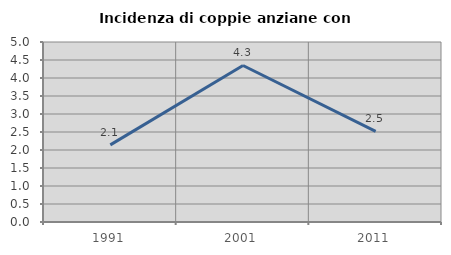
| Category | Incidenza di coppie anziane con figli |
|---|---|
| 1991.0 | 2.143 |
| 2001.0 | 4.348 |
| 2011.0 | 2.516 |